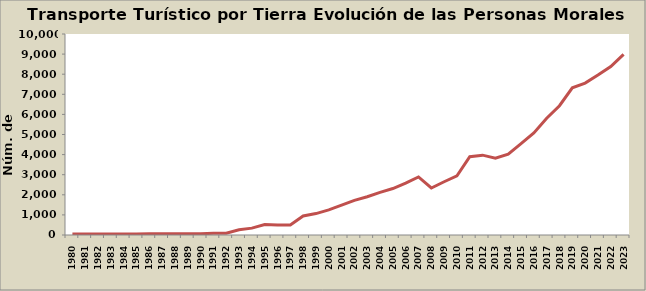
| Category | Series 0 |
|---|---|
| 1980.0 | 50 |
| 1981.0 | 44 |
| 1982.0 | 46 |
| 1983.0 | 54 |
| 1984.0 | 54 |
| 1985.0 | 51 |
| 1986.0 | 56 |
| 1987.0 | 56 |
| 1988.0 | 58 |
| 1989.0 | 60 |
| 1990.0 | 60 |
| 1991.0 | 85 |
| 1992.0 | 90 |
| 1993.0 | 261 |
| 1994.0 | 342 |
| 1995.0 | 523 |
| 1996.0 | 498 |
| 1997.0 | 503 |
| 1998.0 | 948 |
| 1999.0 | 1065 |
| 2000.0 | 1248 |
| 2001.0 | 1483 |
| 2002.0 | 1722 |
| 2003.0 | 1904 |
| 2004.0 | 2120 |
| 2005.0 | 2311 |
| 2006.0 | 2577 |
| 2007.0 | 2888 |
| 2008.0 | 2338 |
| 2009.0 | 2649 |
| 2010.0 | 2942 |
| 2011.0 | 3895 |
| 2012.0 | 3972 |
| 2013.0 | 3820 |
| 2014.0 | 4020 |
| 2015.0 | 4542 |
| 2016.0 | 5080 |
| 2017.0 | 5809 |
| 2018.0 | 6432 |
| 2019.0 | 7325 |
| 2020.0 | 7558 |
| 2021.0 | 7955 |
| 2022.0 | 8379 |
| 2023.0 | 8984 |